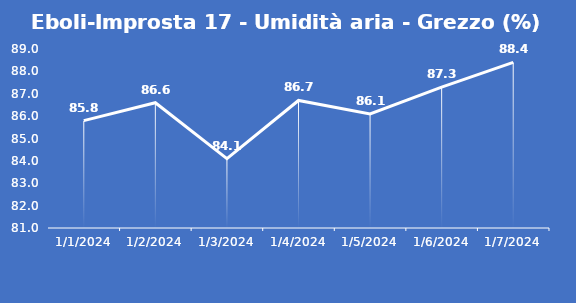
| Category | Eboli-Improsta 17 - Umidità aria - Grezzo (%) |
|---|---|
| 1/1/24 | 85.8 |
| 1/2/24 | 86.6 |
| 1/3/24 | 84.1 |
| 1/4/24 | 86.7 |
| 1/5/24 | 86.1 |
| 1/6/24 | 87.3 |
| 1/7/24 | 88.4 |